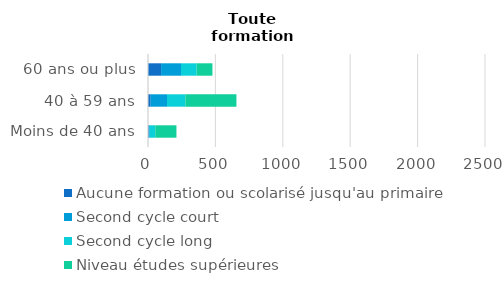
| Category | Aucune formation ou scolarisé jusqu'au primaire | Second cycle court | Second cycle long | Niveau études supérieures |
|---|---|---|---|---|
| Moins de 40 ans | 6 | 7 | 41 | 157 |
| 40 à 59 ans | 20 | 121 | 136 | 379 |
| 60 ans ou plus | 97 | 148 | 116 | 117 |